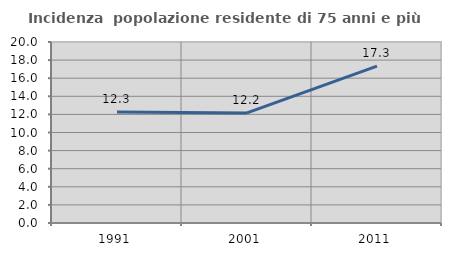
| Category | Incidenza  popolazione residente di 75 anni e più |
|---|---|
| 1991.0 | 12.263 |
| 2001.0 | 12.168 |
| 2011.0 | 17.328 |